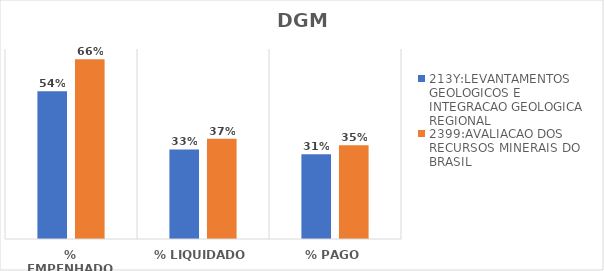
| Category | 213Y:LEVANTAMENTOS GEOLOGICOS E INTEGRACAO GEOLOGICA REGIONAL | 2399:AVALIACAO DOS RECURSOS MINERAIS DO BRASIL |
|---|---|---|
| % EMPENHADO | 0.545 | 0.662 |
| % LIQUIDADO | 0.33 | 0.37 |
| % PAGO | 0.312 | 0.346 |